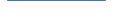
| Category | Series 0 |
|---|---|
| 0 | 23 |
| 1 | 13 |
| 2 | 21 |
| 3 | 15 |
| 4 | 19 |
| 5 | 11 |
| 6 | 18 |
| 7 | 11 |
| 8 | 12 |